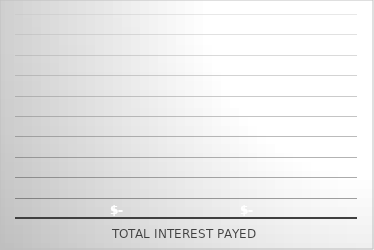
| Category | Interest Paid | Interest Paid (Fixed) |
|---|---|---|
| 0 | 0 | 0 |